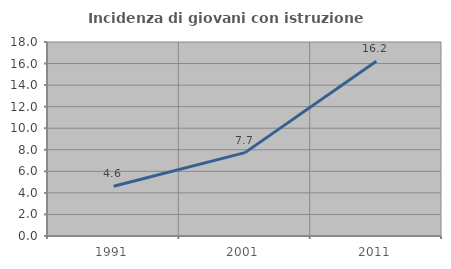
| Category | Incidenza di giovani con istruzione universitaria |
|---|---|
| 1991.0 | 4.61 |
| 2001.0 | 7.737 |
| 2011.0 | 16.214 |